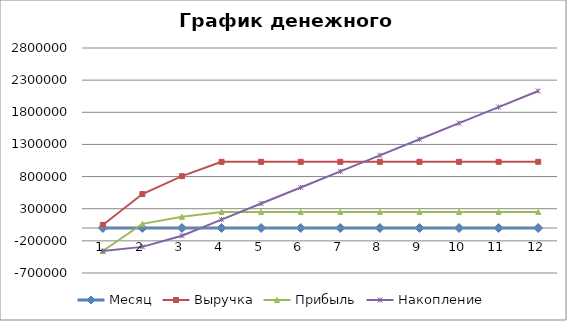
| Category | Месяц | Выручка | Прибыль | Накопление |
|---|---|---|---|---|
| 0 | 1 | 48000 | -358240 | -358240 |
| 1 | 2 | 528000 | 64481 | -293759 |
| 2 | 3 | 806400 | 174222.8 | -119536.2 |
| 3 | 4 | 1029600 | 250062.593 | 130526.393 |
| 4 | 5 | 1029600 | 250062.593 | 380588.986 |
| 5 | 6 | 1029600 | 250062.593 | 630651.579 |
| 6 | 7 | 1029600 | 250062.593 | 880714.171 |
| 7 | 8 | 1029600 | 250062.593 | 1130776.764 |
| 8 | 9 | 1029600 | 250062.593 | 1380839.357 |
| 9 | 10 | 1029600 | 250062.593 | 1630901.95 |
| 10 | 11 | 1029600 | 250062.593 | 1880964.543 |
| 11 | 12 | 1029600 | 250062.593 | 2131027.136 |